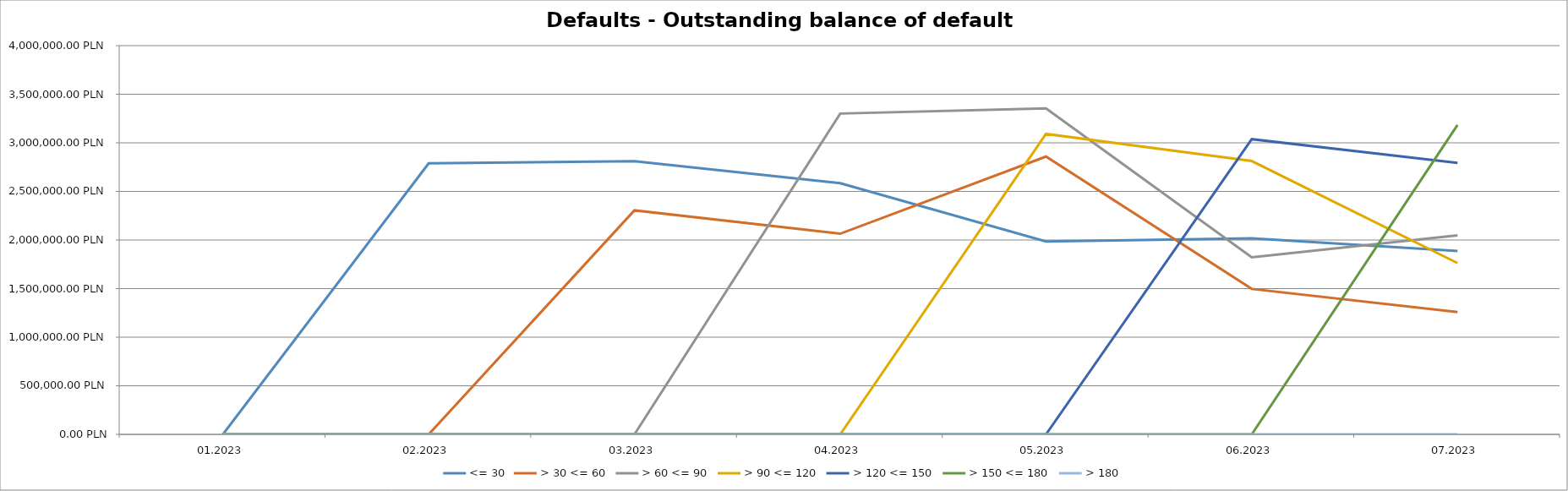
| Category | <= 30 | > 30 <= 60 | > 60 <= 90 | > 90 <= 120 | > 120 <= 150 | > 150 <= 180 | > 180 |
|---|---|---|---|---|---|---|---|
| 01.2023 | 0 | 0 | 0 | 0 | 0 | 0 | 0 |
| 02.2023 | 2788519.82 | 0 | 0 | 0 | 0 | 0 | 0 |
| 03.2023 | 2811517.14 | 2305154.07 | 0 | 0 | 0 | 0 | 0 |
| 04.2023 | 2584791.3 | 2064675.87 | 3301101.31 | 0 | 0 | 0 | 0 |
| 05.2023 | 1985441.56 | 2858398.5 | 3353485.78 | 3091988.77 | 0 | 0 | 0 |
| 06.2023 | 2016845.02 | 1496657.8 | 1822162.63 | 2812422.86 | 3037767.68 | 0 | 0 |
| 07.2023 | 1886118.05 | 1257979.4 | 2047168.21 | 1762916.26 | 2793763.11 | 3184053.47 | 0 |